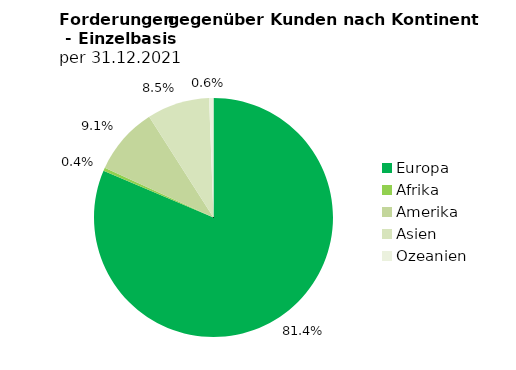
| Category | Series 0 |
|---|---|
| Europa | 24754018 |
| Afrika | 129348 |
| Amerika | 2778377 |
| Asien | 2571818 |
| Ozeanien | 179766 |